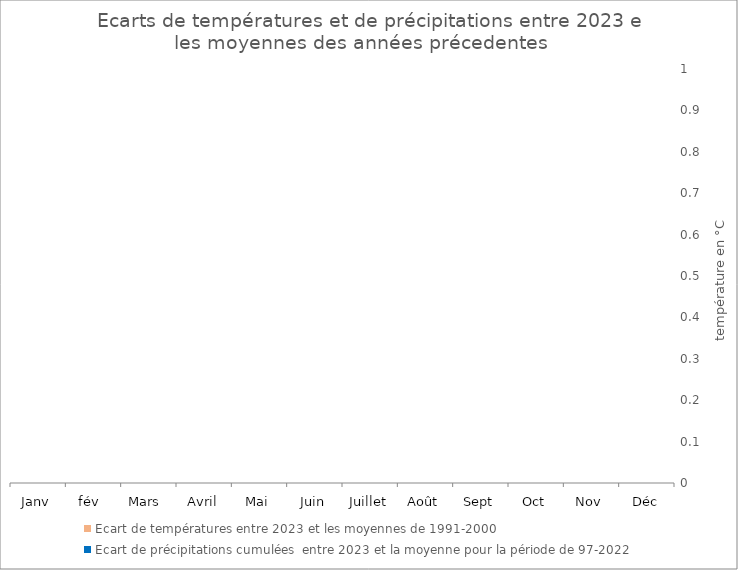
| Category | Ecart de températures entre 2023 et les moyennes de 1991-2000 | Ecart de précipitations cumulées  entre 2023 et la moyenne pour la période de 97-2022 |
|---|---|---|
| Janv | 0 |  |
| fév  | 0 |  |
| Mars  | 0 |  |
| Avril | 0 |  |
| Mai | 0 |  |
| Juin | 0 |  |
| Juillet | 0 |  |
| Août | 0 |  |
| Sept | 0 |  |
| Oct | 0 |  |
| Nov | 0 |  |
| Déc | 0 |  |